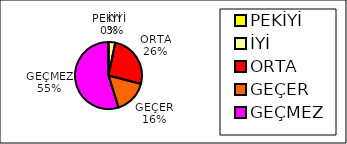
| Category | Series 0 |
|---|---|
| PEKİYİ | 0 |
| İYİ | 1 |
| ORTA | 8 |
| GEÇER | 5 |
| GEÇMEZ | 17 |